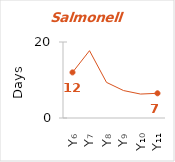
| Category | Salmonella |
|---|---|
| Y₆ | 12 |
| Y₇ | 17.714 |
| Y₈ | 9.375 |
| Y₉ | 7.222 |
| Y₁₀ | 6.3 |
| Y₁₁ | 6.5 |